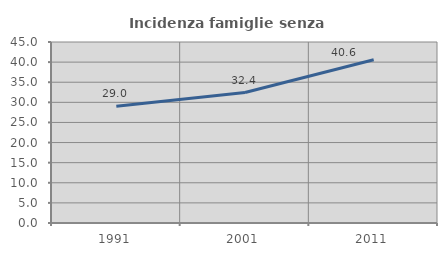
| Category | Incidenza famiglie senza nuclei |
|---|---|
| 1991.0 | 29.023 |
| 2001.0 | 32.432 |
| 2011.0 | 40.57 |